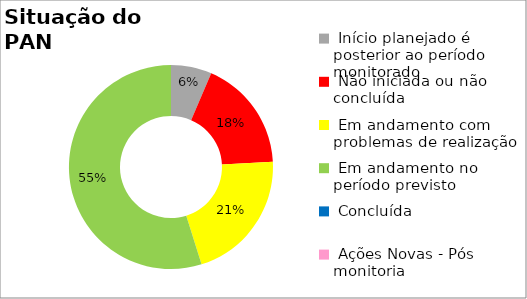
| Category | Series 0 |
|---|---|
|  Início planejado é posterior ao período monitorado | 0.065 |
|  Não iniciada ou não concluída | 0.177 |
|  Em andamento com problemas de realização | 0.21 |
|  Em andamento no período previsto  | 0.548 |
|  Concluída | 0 |
|  Ações Novas - Pós monitoria | 0 |